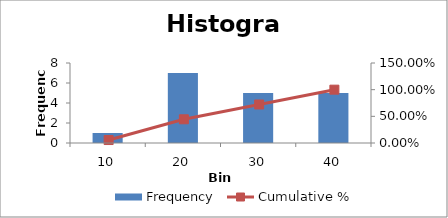
| Category | Frequency |
|---|---|
| 10.0 | 1 |
| 20.0 | 7 |
| 30.0 | 5 |
| 40.0 | 5 |